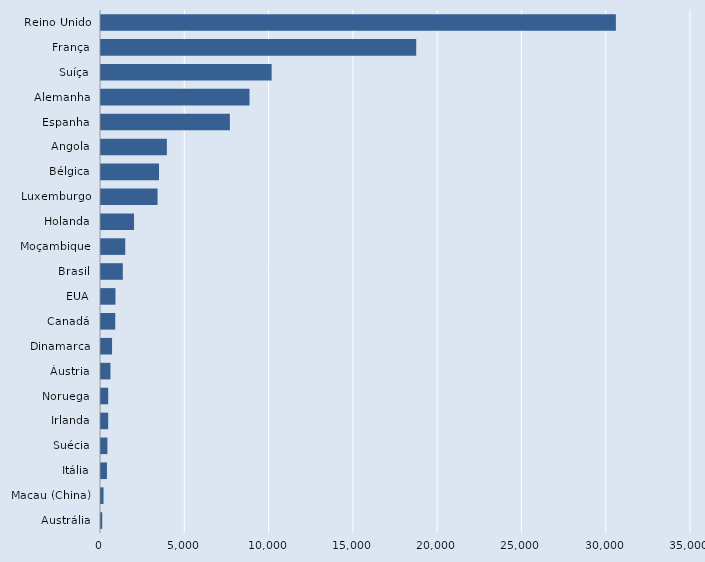
| Category | Series 0 |
|---|---|
| Austrália | 72 |
| Macau (China) | 150 |
| Itália | 354 |
| Suécia | 380 |
| Irlanda | 426 |
| Noruega | 427 |
| Áustria | 561 |
| Dinamarca | 656 |
| Canadá | 845 |
| EUA | 857 |
| Brasil | 1294 |
| Moçambique | 1439 |
| Holanda | 1961 |
| Luxemburgo | 3355 |
| Bélgica | 3442 |
| Angola | 3908 |
| Espanha | 7646 |
| Alemanha | 8810 |
| Suíça | 10123 |
| França | 18700 |
| Reino Unido | 30543 |